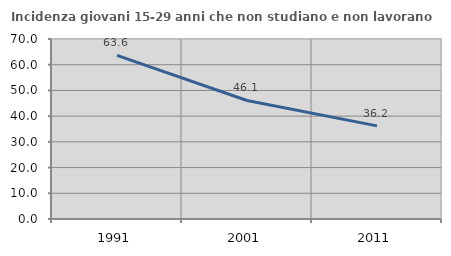
| Category | Incidenza giovani 15-29 anni che non studiano e non lavorano  |
|---|---|
| 1991.0 | 63.606 |
| 2001.0 | 46.088 |
| 2011.0 | 36.208 |